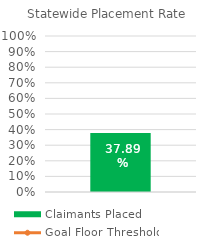
| Category | Claimants Placed |
|---|---|
| 0 | 0.379 |